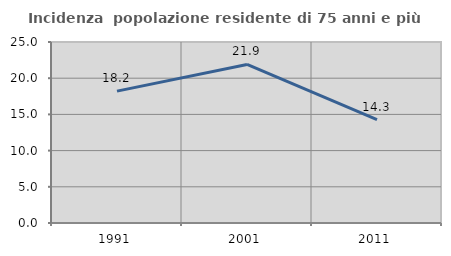
| Category | Incidenza  popolazione residente di 75 anni e più |
|---|---|
| 1991.0 | 18.213 |
| 2001.0 | 21.898 |
| 2011.0 | 14.286 |